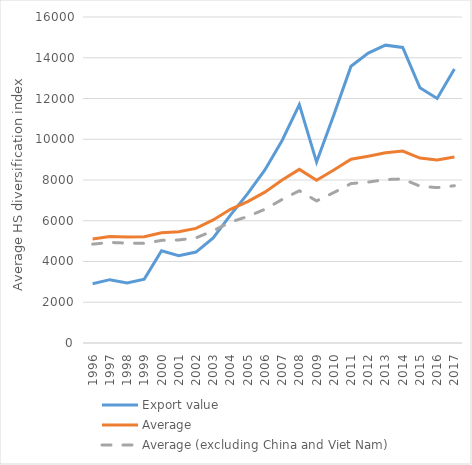
| Category | Export value | Average | Average (excluding China and Viet Nam) |
|---|---|---|---|
| 1996.0 | 2904.072 | 5102.911 | 4850.994 |
| 1997.0 | 3108.678 | 5221.287 | 4934.768 |
| 1998.0 | 2940.675 | 5203.911 | 4903.542 |
| 1999.0 | 3134.113 | 5211.573 | 4890.226 |
| 2000.0 | 4529.209 | 5405.852 | 5036.27 |
| 2001.0 | 4281.556 | 5463.24 | 5058.108 |
| 2002.0 | 4463.263 | 5623.718 | 5160.178 |
| 2003.0 | 5159.33 | 6040.862 | 5507.634 |
| 2004.0 | 6276.109 | 6564.22 | 5934.565 |
| 2005.0 | 7328.543 | 6939.291 | 6209.153 |
| 2006.0 | 8495.416 | 7405.652 | 6562.731 |
| 2007.0 | 9937.881 | 8003.433 | 7043.755 |
| 2008.0 | 11697.759 | 8521.829 | 7471.098 |
| 2009.0 | 8879.636 | 7991.58 | 6974.678 |
| 2010.0 | 11194.924 | 8494.261 | 7381.381 |
| 2011.0 | 13580.959 | 9022.554 | 7824.516 |
| 2012.0 | 14227.067 | 9168.824 | 7897.454 |
| 2013.0 | 14618.592 | 9334.223 | 8021.49 |
| 2014.0 | 14508.457 | 9421.478 | 8051.413 |
| 2015.0 | 12526.14 | 9078.242 | 7696.981 |
| 2016.0 | 11998.572 | 8986.083 | 7626.381 |
| 2017.0 | 13447.14 | 9125.363 | 7717.677 |